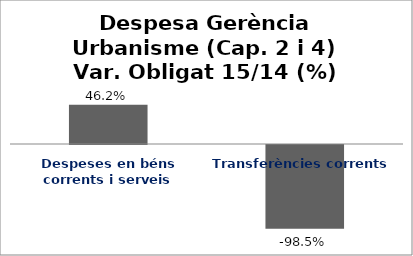
| Category | Series 0 |
|---|---|
| Despeses en béns corrents i serveis | 0.462 |
| Transferències corrents | -0.985 |